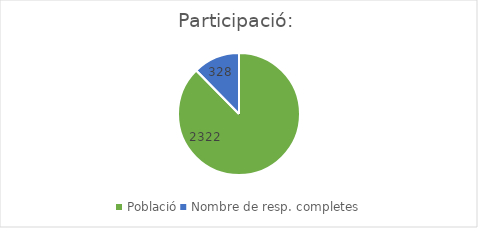
| Category | Series 0 |
|---|---|
| Població | 2322 |
| Nombre de resp. completes | 328 |